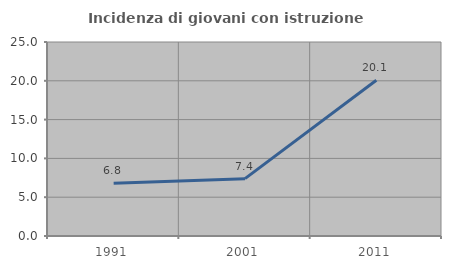
| Category | Incidenza di giovani con istruzione universitaria |
|---|---|
| 1991.0 | 6.782 |
| 2001.0 | 7.392 |
| 2011.0 | 20.069 |